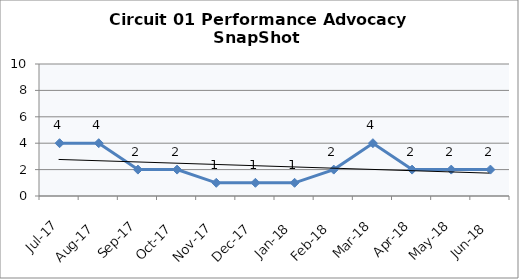
| Category | Circuit 01 |
|---|---|
| Jul-17 | 4 |
| Aug-17 | 4 |
| Sep-17 | 2 |
| Oct-17 | 2 |
| Nov-17 | 1 |
| Dec-17 | 1 |
| Jan-18 | 1 |
| Feb-18 | 2 |
| Mar-18 | 4 |
| Apr-18 | 2 |
| May-18 | 2 |
| Jun-18 | 2 |